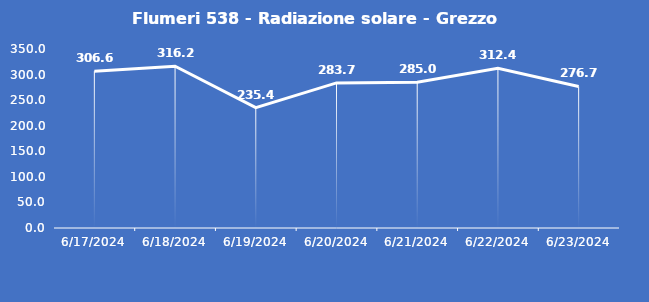
| Category | Flumeri 538 - Radiazione solare - Grezzo (W/m2) |
|---|---|
| 6/17/24 | 306.6 |
| 6/18/24 | 316.2 |
| 6/19/24 | 235.4 |
| 6/20/24 | 283.7 |
| 6/21/24 | 285 |
| 6/22/24 | 312.4 |
| 6/23/24 | 276.7 |